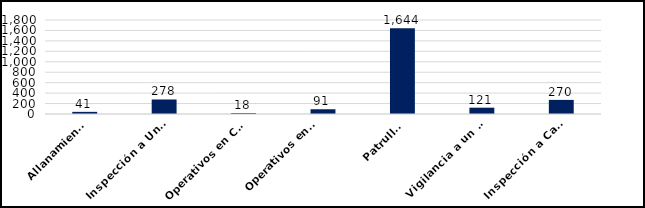
| Category | Series 0 |
|---|---|
| Allanamientos | 41 |
| Inspección a Unidades que transportan Combustibles y Mercancias  | 278 |
| Operativos en Comisión Mixta Interinstitucional | 18 |
| Operativos en Apoyo a la DSCEEC 
 | 91 |
| Patrullas | 1644 |
| Vigilancia a un Punto de Interés  | 121 |
| Inspección a Camiones de Desechos Oleosos | 270 |